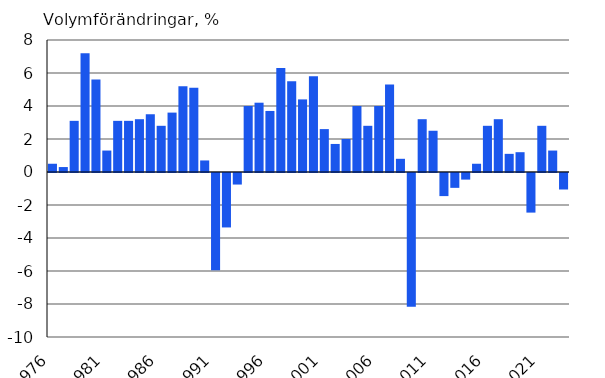
| Category | Volymförändringar, % |
|---|---|
| 1976 | 0.5 |
| 1977 | 0.3 |
| 1978 | 3.1 |
| 1979 | 7.2 |
| 1980 | 5.6 |
| 1981 | 1.3 |
| 1982 | 3.1 |
| 1983 | 3.1 |
| 1984 | 3.2 |
| 1985 | 3.5 |
| 1986 | 2.8 |
| 1987 | 3.6 |
| 1988 | 5.2 |
| 1989 | 5.1 |
| 1990 | 0.7 |
| 1991 | -5.9 |
| 1992 | -3.3 |
| 1993 | -0.7 |
| 1994 | 4 |
| 1995 | 4.2 |
| 1996 | 3.7 |
| 1997 | 6.3 |
| 1998 | 5.5 |
| 1999 | 4.4 |
| 2000 | 5.8 |
| 2001 | 2.6 |
| 2002 | 1.7 |
| 2003 | 2 |
| 2004 | 4 |
| 2005 | 2.8 |
| 2006 | 4 |
| 2007 | 5.3 |
| 2008 | 0.8 |
| 2009 | -8.1 |
| 2010 | 3.2 |
| 2011 | 2.5 |
| 2012 | -1.4 |
| 2013 | -0.9 |
| 2014 | -0.4 |
| 2015 | 0.5 |
| 2016 | 2.8 |
| 2017 | 3.2 |
| 2018 | 1.1 |
| 2019 | 1.2 |
| 2020 | -2.4 |
| 2021 | 2.8 |
| 2022* | 1.3 |
| 2023* | -1 |